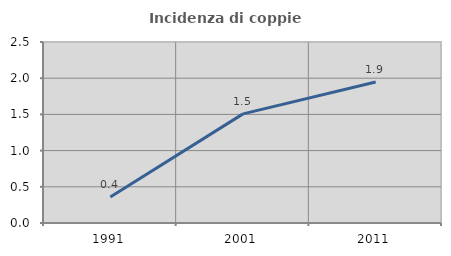
| Category | Incidenza di coppie miste |
|---|---|
| 1991.0 | 0.36 |
| 2001.0 | 1.507 |
| 2011.0 | 1.948 |